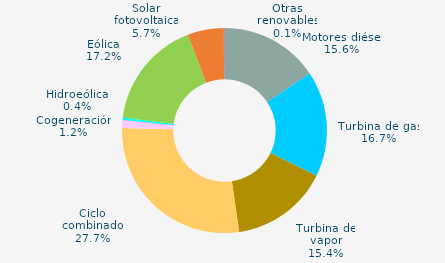
| Category | Series 0 |
|---|---|
| Motores diésel | 15.603 |
| Turbina de gas | 16.663 |
| Turbina de vapor | 15.443 |
| Ciclo combinado | 27.69 |
| Cogeneración | 1.222 |
| Hidráulica | 0.049 |
| Hidroeólica | 0.362 |
| Eólica | 17.151 |
| Solar fotovoltaica | 5.698 |
| Otras renovables | 0.118 |